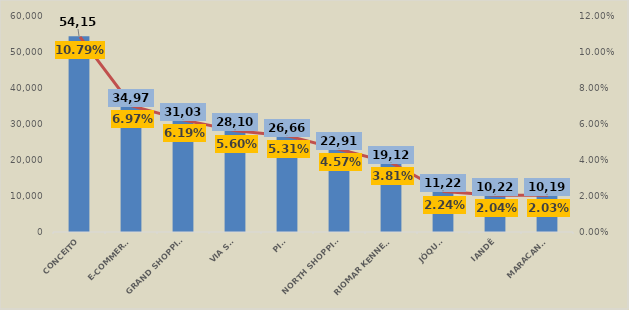
| Category | Em R$ 1 |
|---|---|
| CONCEITO | 54152.202 |
| E-COMMERCE | 34974.681 |
| GRAND SHOPPING | 31039.127 |
| VIA SUL | 28105.425 |
| PICI | 26661.894 |
| NORTH SHOPPING | 22910.515 |
| RIOMAR KENNEDY | 19123.21 |
| JÓQUEI | 11229.391 |
| IANDÊ | 10223.343 |
| MARACANAÚ | 10198.632 |